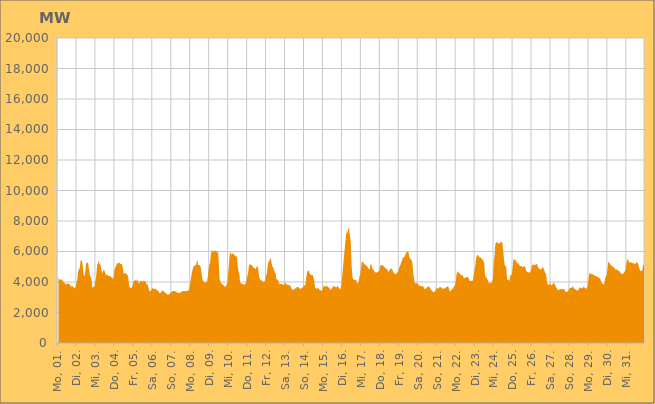
| Category | Series 0 |
|---|---|
|  Mo, 01.  | 4266.584 |
|  Mo, 01.  | 4207.578 |
|  Mo, 01.  | 4142.851 |
|  Mo, 01.  | 4136.333 |
|  Mo, 01.  | 4178.557 |
|  Mo, 01.  | 4119.281 |
|  Mo, 01.  | 4026.68 |
|  Mo, 01.  | 4001.426 |
|  Mo, 01.  | 3944.814 |
|  Mo, 01.  | 3851.609 |
|  Mo, 01.  | 3824.859 |
|  Mo, 01.  | 3942.209 |
|  Mo, 01.  | 3882.206 |
|  Mo, 01.  | 3872.921 |
|  Mo, 01.  | 3870.127 |
|  Mo, 01.  | 3776.172 |
|  Mo, 01.  | 3683.18 |
|  Di, 02.  | 3729.327 |
|  Di, 02.  | 3733.236 |
|  Di, 02.  | 3667.491 |
|  Di, 02.  | 3588.442 |
|  Di, 02.  | 3607.905 |
|  Di, 02.  | 3697.948 |
|  Di, 02.  | 3981.073 |
|  Di, 02.  | 4131.693 |
|  Di, 02.  | 4684.604 |
|  Di, 02.  | 4819.84 |
|  Di, 02.  | 4925.777 |
|  Di, 02.  | 5365.699 |
|  Di, 02.  | 5452.281 |
|  Di, 02.  | 5353.521 |
|  Di, 02.  | 4989.246 |
|  Di, 02.  | 4434.675 |
|  Di, 02.  | 4390.629 |
|  Di, 02.  | 4612.217 |
|  Di, 02.  | 5207.136 |
|  Di, 02.  | 5240.932 |
|  Di, 02.  | 5285.204 |
|  Di, 02.  | 5088 |
|  Di, 02.  | 4704.854 |
|  Di, 02.  | 4386.76 |
|  Mi, 03.  | 4378.635 |
|  Mi, 03.  | 4099.421 |
|  Mi, 03.  | 3653.123 |
|  Mi, 03.  | 3667.025 |
|  Mi, 03.  | 3683.099 |
|  Mi, 03.  | 3785.335 |
|  Mi, 03.  | 4102.896 |
|  Mi, 03.  | 4456.347 |
|  Mi, 03.  | 5098.884 |
|  Mi, 03.  | 5218.346 |
|  Mi, 03.  | 5398.458 |
|  Mi, 03.  | 5198.235 |
|  Mi, 03.  | 5131.548 |
|  Mi, 03.  | 4938.137 |
|  Mi, 03.  | 4635.025 |
|  Mi, 03.  | 4602.471 |
|  Mi, 03.  | 4766.044 |
|  Mi, 03.  | 4805.549 |
|  Mi, 03.  | 4620.981 |
|  Mi, 03.  | 4457.036 |
|  Mi, 03.  | 4480.844 |
|  Mi, 03.  | 4491.056 |
|  Mi, 03.  | 4400.802 |
|  Mi, 03.  | 4400.6 |
|  Do, 04.  | 4395.809 |
|  Do, 04.  | 4376.327 |
|  Do, 04.  | 4290.164 |
|  Do, 04.  | 4306.76 |
|  Do, 04.  | 4186.07 |
|  Do, 04.  | 4304.95 |
|  Do, 04.  | 4773.455 |
|  Do, 04.  | 4964.536 |
|  Do, 04.  | 5024.203 |
|  Do, 04.  | 5283.835 |
|  Do, 04.  | 5169.109 |
|  Do, 04.  | 5235.425 |
|  Do, 04.  | 5294.251 |
|  Do, 04.  | 5225.783 |
|  Do, 04.  | 5175.498 |
|  Do, 04.  | 5171.25 |
|  Do, 04.  | 5111.219 |
|  Do, 04.  | 4751.023 |
|  Do, 04.  | 4503.815 |
|  Do, 04.  | 4572.222 |
|  Do, 04.  | 4595.924 |
|  Do, 04.  | 4549.286 |
|  Do, 04.  | 4498.235 |
|  Do, 04.  | 4381.834 |
|  Fr, 05.  | 4026.381 |
|  Fr, 05.  | 3673.328 |
|  Fr, 05.  | 3605.814 |
|  Fr, 05.  | 3608.928 |
|  Fr, 05.  | 3652.192 |
|  Fr, 05.  | 3755.646 |
|  Fr, 05.  | 4008.803 |
|  Fr, 05.  | 4079.187 |
|  Fr, 05.  | 4126.906 |
|  Fr, 05.  | 4107.322 |
|  Fr, 05.  | 4079.678 |
|  Fr, 05.  | 4154.262 |
|  Fr, 05.  | 4014.946 |
|  Fr, 05.  | 3904.06 |
|  Fr, 05.  | 3971.547 |
|  Fr, 05.  | 4124.928 |
|  Fr, 05.  | 4027.803 |
|  Fr, 05.  | 4024.305 |
|  Fr, 05.  | 4053.006 |
|  Fr, 05.  | 4092.909 |
|  Fr, 05.  | 4064.665 |
|  Fr, 05.  | 4035.888 |
|  Fr, 05.  | 3943.914 |
|  Fr, 05.  | 3823.59 |
|  Sa, 06.  | 3833.231 |
|  Sa, 06.  | 3624.199 |
|  Sa, 06.  | 3404.672 |
|  Sa, 06.  | 3385.497 |
|  Sa, 06.  | 3448.437 |
|  Sa, 06.  | 3504.127 |
|  Sa, 06.  | 3624.401 |
|  Sa, 06.  | 3551.205 |
|  Sa, 06.  | 3544.459 |
|  Sa, 06.  | 3557.966 |
|  Sa, 06.  | 3551.408 |
|  Sa, 06.  | 3498.239 |
|  Sa, 06.  | 3462.628 |
|  Sa, 06.  | 3436.751 |
|  Sa, 06.  | 3347.883 |
|  Sa, 06.  | 3255.176 |
|  Sa, 06.  | 3262.053 |
|  Sa, 06.  | 3356.908 |
|  Sa, 06.  | 3379.743 |
|  Sa, 06.  | 3458.865 |
|  Sa, 06.  | 3422.175 |
|  Sa, 06.  | 3351.151 |
|  Sa, 06.  | 3292.023 |
|  Sa, 06.  | 3275.325 |
|  So, 07.  | 3223.044 |
|  So, 07.  | 3169.732 |
|  So, 07.  | 3169.601 |
|  So, 07.  | 3194.148 |
|  So, 07.  | 3223.645 |
|  So, 07.  | 3287.04 |
|  So, 07.  | 3335.56 |
|  So, 07.  | 3388.264 |
|  So, 07.  | 3398.74 |
|  So, 07.  | 3421.246 |
|  So, 07.  | 3399.241 |
|  So, 07.  | 3390.898 |
|  So, 07.  | 3355.918 |
|  So, 07.  | 3319.04 |
|  So, 07.  | 3277.578 |
|  So, 07.  | 3289.176 |
|  So, 07.  | 3278.985 |
|  So, 07.  | 3313.175 |
|  So, 07.  | 3301.348 |
|  So, 07.  | 3361.388 |
|  So, 07.  | 3406.708 |
|  So, 07.  | 3416.514 |
|  So, 07.  | 3380.782 |
|  So, 07.  | 3414.284 |
|  Mo, 08.  | 3396.313 |
|  Mo, 08.  | 3410.681 |
|  Mo, 08.  | 3419.089 |
|  Mo, 08.  | 3415.613 |
|  Mo, 08.  | 3461.163 |
|  Mo, 08.  | 3657.752 |
|  Mo, 08.  | 3959.098 |
|  Mo, 08.  | 4292.898 |
|  Mo, 08.  | 4639.932 |
|  Mo, 08.  | 4811.855 |
|  Mo, 08.  | 5051.792 |
|  Mo, 08.  | 5024.158 |
|  Mo, 08.  | 5118.61 |
|  Mo, 08.  | 5098.471 |
|  Mo, 08.  | 5272.455 |
|  Mo, 08.  | 5440.01 |
|  Mo, 08.  | 5060.81 |
|  Mo, 08.  | 5148.86 |
|  Mo, 08.  | 5084.443 |
|  Mo, 08.  | 5000.263 |
|  Mo, 08.  | 4657.849 |
|  Mo, 08.  | 4265.625 |
|  Mo, 08.  | 4092.357 |
|  Mo, 08.  | 4014.093 |
|  Di, 09.  | 3982.54 |
|  Di, 09.  | 3955.887 |
|  Di, 09.  | 3988.986 |
|  Di, 09.  | 4012.532 |
|  Di, 09.  | 4314.087 |
|  Di, 09.  | 4715.244 |
|  Di, 09.  | 5095.673 |
|  Di, 09.  | 5292.076 |
|  Di, 09.  | 5808.207 |
|  Di, 09.  | 6101.633 |
|  Di, 09.  | 6038.916 |
|  Di, 09.  | 5958.046 |
|  Di, 09.  | 5981.52 |
|  Di, 09.  | 6069.245 |
|  Di, 09.  | 6053.791 |
|  Di, 09.  | 6028.615 |
|  Di, 09.  | 5897.677 |
|  Di, 09.  | 6072.762 |
|  Di, 09.  | 5282.016 |
|  Di, 09.  | 4194.256 |
|  Di, 09.  | 4021.826 |
|  Di, 09.  | 3931.777 |
|  Di, 09.  | 3883.43 |
|  Di, 09.  | 3829.882 |
|  Mi, 10.  | 3788.146 |
|  Mi, 10.  | 3712.188 |
|  Mi, 10.  | 3692.297 |
|  Mi, 10.  | 3729.466 |
|  Mi, 10.  | 3818.103 |
|  Mi, 10.  | 3978.602 |
|  Mi, 10.  | 4589.727 |
|  Mi, 10.  | 5206.673 |
|  Mi, 10.  | 5871.344 |
|  Mi, 10.  | 5962.463 |
|  Mi, 10.  | 5779.443 |
|  Mi, 10.  | 5854.011 |
|  Mi, 10.  | 5884.089 |
|  Mi, 10.  | 5832.502 |
|  Mi, 10.  | 5749.953 |
|  Mi, 10.  | 5710.826 |
|  Mi, 10.  | 5684.763 |
|  Mi, 10.  | 5655.735 |
|  Mi, 10.  | 5042.726 |
|  Mi, 10.  | 4703.938 |
|  Mi, 10.  | 4529.376 |
|  Mi, 10.  | 3979.57 |
|  Mi, 10.  | 3928.338 |
|  Mi, 10.  | 3886.89 |
|  Do, 11.  | 3869.402 |
|  Do, 11.  | 3861.557 |
|  Do, 11.  | 3801.725 |
|  Do, 11.  | 3858.974 |
|  Do, 11.  | 3894.192 |
|  Do, 11.  | 4069.333 |
|  Do, 11.  | 4386.352 |
|  Do, 11.  | 4523.686 |
|  Do, 11.  | 4995.199 |
|  Do, 11.  | 5160.975 |
|  Do, 11.  | 5166.501 |
|  Do, 11.  | 5117.41 |
|  Do, 11.  | 5093.519 |
|  Do, 11.  | 5026.197 |
|  Do, 11.  | 4931.369 |
|  Do, 11.  | 4917.518 |
|  Do, 11.  | 4876.344 |
|  Do, 11.  | 4844.597 |
|  Do, 11.  | 4999.228 |
|  Do, 11.  | 5055.586 |
|  Do, 11.  | 4858.15 |
|  Do, 11.  | 4315.05 |
|  Do, 11.  | 4223.389 |
|  Do, 11.  | 4095.24 |
|  Fr, 12.  | 4128.802 |
|  Fr, 12.  | 4053.192 |
|  Fr, 12.  | 4029.311 |
|  Fr, 12.  | 3972.964 |
|  Fr, 12.  | 4039.48 |
|  Fr, 12.  | 4144.088 |
|  Fr, 12.  | 4435.723 |
|  Fr, 12.  | 4606.4 |
|  Fr, 12.  | 5069.306 |
|  Fr, 12.  | 5360.484 |
|  Fr, 12.  | 5367.358 |
|  Fr, 12.  | 5534.396 |
|  Fr, 12.  | 5508.195 |
|  Fr, 12.  | 5225.88 |
|  Fr, 12.  | 4983.198 |
|  Fr, 12.  | 4957.262 |
|  Fr, 12.  | 4749.433 |
|  Fr, 12.  | 4659.237 |
|  Fr, 12.  | 4536.272 |
|  Fr, 12.  | 4155.428 |
|  Fr, 12.  | 4195.29 |
|  Fr, 12.  | 4113.095 |
|  Fr, 12.  | 3975.654 |
|  Fr, 12.  | 3848.165 |
|  Sa, 13.  | 3872.33 |
|  Sa, 13.  | 3878.477 |
|  Sa, 13.  | 3865.734 |
|  Sa, 13.  | 3841.395 |
|  Sa, 13.  | 3797.026 |
|  Sa, 13.  | 3843.227 |
|  Sa, 13.  | 4008.504 |
|  Sa, 13.  | 3881.286 |
|  Sa, 13.  | 3822.617 |
|  Sa, 13.  | 3823.436 |
|  Sa, 13.  | 3803.688 |
|  Sa, 13.  | 3801.039 |
|  Sa, 13.  | 3773.238 |
|  Sa, 13.  | 3708.212 |
|  Sa, 13.  | 3560.133 |
|  Sa, 13.  | 3527.584 |
|  Sa, 13.  | 3444.236 |
|  Sa, 13.  | 3506.761 |
|  Sa, 13.  | 3535.318 |
|  Sa, 13.  | 3594.088 |
|  Sa, 13.  | 3597.545 |
|  Sa, 13.  | 3676.906 |
|  Sa, 13.  | 3673.902 |
|  Sa, 13.  | 3658.134 |
|  So, 14.  | 3619.079 |
|  So, 14.  | 3523.523 |
|  So, 14.  | 3573.533 |
|  So, 14.  | 3611.802 |
|  So, 14.  | 3639.83 |
|  So, 14.  | 3691.323 |
|  So, 14.  | 3790.863 |
|  So, 14.  | 3760.086 |
|  So, 14.  | 3919.873 |
|  So, 14.  | 4407.218 |
|  So, 14.  | 4659.017 |
|  So, 14.  | 4738.002 |
|  So, 14.  | 4766.876 |
|  So, 14.  | 4545.176 |
|  So, 14.  | 4486.328 |
|  So, 14.  | 4465.832 |
|  So, 14.  | 4436.812 |
|  So, 14.  | 4473.541 |
|  So, 14.  | 4257.081 |
|  So, 14.  | 4028.457 |
|  So, 14.  | 3608.156 |
|  So, 14.  | 3605.114 |
|  So, 14.  | 3531.269 |
|  So, 14.  | 3588.919 |
|  Mo, 15.  | 3611.145 |
|  Mo, 15.  | 3522.345 |
|  Mo, 15.  | 3453.403 |
|  Mo, 15.  | 3461.085 |
|  Mo, 15.  | 3395.567 |
|  Mo, 15.  | 3487.022 |
|  Mo, 15.  | 3644.004 |
|  Mo, 15.  | 3766.616 |
|  Mo, 15.  | 3720.415 |
|  Mo, 15.  | 3687.92 |
|  Mo, 15.  | 3761.296 |
|  Mo, 15.  | 3731.5 |
|  Mo, 15.  | 3690.912 |
|  Mo, 15.  | 3634.153 |
|  Mo, 15.  | 3620.737 |
|  Mo, 15.  | 3501.559 |
|  Mo, 15.  | 3503.364 |
|  Mo, 15.  | 3586.759 |
|  Mo, 15.  | 3633.574 |
|  Mo, 15.  | 3713.001 |
|  Mo, 15.  | 3762.418 |
|  Mo, 15.  | 3684.34 |
|  Mo, 15.  | 3669.077 |
|  Mo, 15.  | 3641.853 |
|  Di, 16.  | 3712.756 |
|  Di, 16.  | 3731.158 |
|  Di, 16.  | 3621.221 |
|  Di, 16.  | 3512.816 |
|  Di, 16.  | 3555.695 |
|  Di, 16.  | 3738.116 |
|  Di, 16.  | 4230.882 |
|  Di, 16.  | 4791.6 |
|  Di, 16.  | 5408.756 |
|  Di, 16.  | 5958.473 |
|  Di, 16.  | 6487.033 |
|  Di, 16.  | 7029.712 |
|  Di, 16.  | 7419.717 |
|  Di, 16.  | 7153.472 |
|  Di, 16.  | 7556.917 |
|  Di, 16.  | 7477.579 |
|  Di, 16.  | 7007.325 |
|  Di, 16.  | 6740.205 |
|  Di, 16.  | 5223.879 |
|  Di, 16.  | 4396.474 |
|  Di, 16.  | 4157.353 |
|  Di, 16.  | 4187.06 |
|  Di, 16.  | 4131.433 |
|  Di, 16.  | 4137.685 |
|  Mi, 17.  | 4116.645 |
|  Mi, 17.  | 3937.646 |
|  Mi, 17.  | 3891.152 |
|  Mi, 17.  | 4045.145 |
|  Mi, 17.  | 4332.059 |
|  Mi, 17.  | 4477.828 |
|  Mi, 17.  | 4861.762 |
|  Mi, 17.  | 5290.53 |
|  Mi, 17.  | 5361.404 |
|  Mi, 17.  | 5273.064 |
|  Mi, 17.  | 5178.638 |
|  Mi, 17.  | 5117.929 |
|  Mi, 17.  | 5139.2 |
|  Mi, 17.  | 5030.591 |
|  Mi, 17.  | 5050.715 |
|  Mi, 17.  | 4895.541 |
|  Mi, 17.  | 4844.927 |
|  Mi, 17.  | 4841.266 |
|  Mi, 17.  | 5138.604 |
|  Mi, 17.  | 5212.792 |
|  Mi, 17.  | 4950.426 |
|  Mi, 17.  | 4832.359 |
|  Mi, 17.  | 4822.388 |
|  Mi, 17.  | 4682.353 |
|  Do, 18.  | 4654.895 |
|  Do, 18.  | 4594.648 |
|  Do, 18.  | 4621.247 |
|  Do, 18.  | 4657.116 |
|  Do, 18.  | 4682.035 |
|  Do, 18.  | 4739.432 |
|  Do, 18.  | 4956.957 |
|  Do, 18.  | 5127.578 |
|  Do, 18.  | 5113.836 |
|  Do, 18.  | 5098.832 |
|  Do, 18.  | 5075.193 |
|  Do, 18.  | 5015.947 |
|  Do, 18.  | 4957.636 |
|  Do, 18.  | 4923.281 |
|  Do, 18.  | 4856.705 |
|  Do, 18.  | 4823.58 |
|  Do, 18.  | 4744.813 |
|  Do, 18.  | 4621.849 |
|  Do, 18.  | 4773.672 |
|  Do, 18.  | 4837.342 |
|  Do, 18.  | 4865.73 |
|  Do, 18.  | 4910.905 |
|  Do, 18.  | 4768.93 |
|  Do, 18.  | 4628.989 |
|  Fr, 19.  | 4584.746 |
|  Fr, 19.  | 4524.075 |
|  Fr, 19.  | 4500.725 |
|  Fr, 19.  | 4555.653 |
|  Fr, 19.  | 4634.17 |
|  Fr, 19.  | 4689.406 |
|  Fr, 19.  | 4891.704 |
|  Fr, 19.  | 5030.415 |
|  Fr, 19.  | 5118.745 |
|  Fr, 19.  | 5296.85 |
|  Fr, 19.  | 5420.494 |
|  Fr, 19.  | 5646.479 |
|  Fr, 19.  | 5592.952 |
|  Fr, 19.  | 5639.565 |
|  Fr, 19.  | 5777.991 |
|  Fr, 19.  | 5874.595 |
|  Fr, 19.  | 5963.642 |
|  Fr, 19.  | 5957.175 |
|  Fr, 19.  | 6001.779 |
|  Fr, 19.  | 5669.946 |
|  Fr, 19.  | 5571.368 |
|  Fr, 19.  | 5494.56 |
|  Fr, 19.  | 5431.453 |
|  Fr, 19.  | 5267.5 |
|  Sa, 20.  | 4727.202 |
|  Sa, 20.  | 4263.007 |
|  Sa, 20.  | 3943.993 |
|  Sa, 20.  | 3894.511 |
|  Sa, 20.  | 3934.349 |
|  Sa, 20.  | 3865.807 |
|  Sa, 20.  | 3931.456 |
|  Sa, 20.  | 3775.553 |
|  Sa, 20.  | 3771.221 |
|  Sa, 20.  | 3737.462 |
|  Sa, 20.  | 3733.583 |
|  Sa, 20.  | 3714.112 |
|  Sa, 20.  | 3734.096 |
|  Sa, 20.  | 3692.733 |
|  Sa, 20.  | 3580.859 |
|  Sa, 20.  | 3516.416 |
|  Sa, 20.  | 3564.171 |
|  Sa, 20.  | 3622.173 |
|  Sa, 20.  | 3676.498 |
|  Sa, 20.  | 3700.053 |
|  Sa, 20.  | 3697.406 |
|  Sa, 20.  | 3650.829 |
|  Sa, 20.  | 3553.666 |
|  Sa, 20.  | 3482.146 |
|  So, 21.  | 3417.088 |
|  So, 21.  | 3364.95 |
|  So, 21.  | 3325.83 |
|  So, 21.  | 3355.656 |
|  So, 21.  | 3399.44 |
|  So, 21.  | 3539.664 |
|  So, 21.  | 3636.151 |
|  So, 21.  | 3549.54 |
|  So, 21.  | 3570.533 |
|  So, 21.  | 3643.026 |
|  So, 21.  | 3666.054 |
|  So, 21.  | 3670.703 |
|  So, 21.  | 3606.56 |
|  So, 21.  | 3571.288 |
|  So, 21.  | 3585.232 |
|  So, 21.  | 3550.393 |
|  So, 21.  | 3579.322 |
|  So, 21.  | 3635.507 |
|  So, 21.  | 3665.135 |
|  So, 21.  | 3692.584 |
|  So, 21.  | 3735.339 |
|  So, 21.  | 3619.553 |
|  So, 21.  | 3442.515 |
|  So, 21.  | 3370.719 |
|  Mo, 22.  | 3463.812 |
|  Mo, 22.  | 3508.062 |
|  Mo, 22.  | 3557.531 |
|  Mo, 22.  | 3633.777 |
|  Mo, 22.  | 3726.341 |
|  Mo, 22.  | 3781.764 |
|  Mo, 22.  | 4046.092 |
|  Mo, 22.  | 4521.04 |
|  Mo, 22.  | 4661.677 |
|  Mo, 22.  | 4700.317 |
|  Mo, 22.  | 4569.704 |
|  Mo, 22.  | 4579.692 |
|  Mo, 22.  | 4485.39 |
|  Mo, 22.  | 4439.399 |
|  Mo, 22.  | 4411.411 |
|  Mo, 22.  | 4481.838 |
|  Mo, 22.  | 4234.955 |
|  Mo, 22.  | 4264.389 |
|  Mo, 22.  | 4277.714 |
|  Mo, 22.  | 4291.098 |
|  Mo, 22.  | 4340.023 |
|  Mo, 22.  | 4337.639 |
|  Mo, 22.  | 4250.189 |
|  Mo, 22.  | 4177.259 |
|  Di, 23.  | 4039.208 |
|  Di, 23.  | 4069.626 |
|  Di, 23.  | 4085.93 |
|  Di, 23.  | 4067.467 |
|  Di, 23.  | 4199.35 |
|  Di, 23.  | 4566.604 |
|  Di, 23.  | 4846.334 |
|  Di, 23.  | 5157.302 |
|  Di, 23.  | 5643.066 |
|  Di, 23.  | 5750.118 |
|  Di, 23.  | 5774.014 |
|  Di, 23.  | 5699.271 |
|  Di, 23.  | 5608.374 |
|  Di, 23.  | 5609.434 |
|  Di, 23.  | 5587.192 |
|  Di, 23.  | 5498.422 |
|  Di, 23.  | 5488.226 |
|  Di, 23.  | 5364.518 |
|  Di, 23.  | 5226.027 |
|  Di, 23.  | 4464.973 |
|  Di, 23.  | 4318.953 |
|  Di, 23.  | 4275.583 |
|  Di, 23.  | 4171.025 |
|  Di, 23.  | 4034.883 |
|  Mi, 24.  | 3923.116 |
|  Mi, 24.  | 3925.352 |
|  Mi, 24.  | 3933.354 |
|  Mi, 24.  | 3939.658 |
|  Mi, 24.  | 4017.312 |
|  Mi, 24.  | 4254.842 |
|  Mi, 24.  | 5314.242 |
|  Mi, 24.  | 5633.86 |
|  Mi, 24.  | 6462.559 |
|  Mi, 24.  | 6592.733 |
|  Mi, 24.  | 6593.322 |
|  Mi, 24.  | 6624.795 |
|  Mi, 24.  | 6485.382 |
|  Mi, 24.  | 6561.444 |
|  Mi, 24.  | 6516.26 |
|  Mi, 24.  | 6664.373 |
|  Mi, 24.  | 6635.365 |
|  Mi, 24.  | 6532.393 |
|  Mi, 24.  | 6053.335 |
|  Mi, 24.  | 5486.807 |
|  Mi, 24.  | 5084.122 |
|  Mi, 24.  | 5069.213 |
|  Mi, 24.  | 4857.856 |
|  Mi, 24.  | 4154.853 |
|  Do, 25.  | 4148.204 |
|  Do, 25.  | 4130.334 |
|  Do, 25.  | 4054.011 |
|  Do, 25.  | 4411.047 |
|  Do, 25.  | 4457.971 |
|  Do, 25.  | 4540.706 |
|  Do, 25.  | 4979.749 |
|  Do, 25.  | 5477.628 |
|  Do, 25.  | 5499.283 |
|  Do, 25.  | 5433.53 |
|  Do, 25.  | 5413.103 |
|  Do, 25.  | 5290.601 |
|  Do, 25.  | 5194.91 |
|  Do, 25.  | 5255.19 |
|  Do, 25.  | 5139.274 |
|  Do, 25.  | 5062.966 |
|  Do, 25.  | 5043.404 |
|  Do, 25.  | 5066.42 |
|  Do, 25.  | 4957.723 |
|  Do, 25.  | 4978.344 |
|  Do, 25.  | 5052.29 |
|  Do, 25.  | 5022.643 |
|  Do, 25.  | 4990.197 |
|  Do, 25.  | 4750.937 |
|  Fr, 26.  | 4677.297 |
|  Fr, 26.  | 4643.542 |
|  Fr, 26.  | 4632.564 |
|  Fr, 26.  | 4620.64 |
|  Fr, 26.  | 4639.372 |
|  Fr, 26.  | 4735.122 |
|  Fr, 26.  | 4986.618 |
|  Fr, 26.  | 5121.39 |
|  Fr, 26.  | 5135.882 |
|  Fr, 26.  | 5135.246 |
|  Fr, 26.  | 5110.746 |
|  Fr, 26.  | 5143.795 |
|  Fr, 26.  | 5172.835 |
|  Fr, 26.  | 5170.799 |
|  Fr, 26.  | 4984.992 |
|  Fr, 26.  | 4884.945 |
|  Fr, 26.  | 4873.803 |
|  Fr, 26.  | 4822.868 |
|  Fr, 26.  | 4815.503 |
|  Fr, 26.  | 4917.574 |
|  Fr, 26.  | 4974.638 |
|  Fr, 26.  | 4915.606 |
|  Fr, 26.  | 4793.88 |
|  Fr, 26.  | 4597.869 |
|  Sa, 27.  | 4557.883 |
|  Sa, 27.  | 4223.953 |
|  Sa, 27.  | 3868.317 |
|  Sa, 27.  | 3807.978 |
|  Sa, 27.  | 3873.125 |
|  Sa, 27.  | 3821.399 |
|  Sa, 27.  | 3888.236 |
|  Sa, 27.  | 3783.87 |
|  Sa, 27.  | 3784.152 |
|  Sa, 27.  | 3890.231 |
|  Sa, 27.  | 3981.987 |
|  Sa, 27.  | 3879.348 |
|  Sa, 27.  | 3782.508 |
|  Sa, 27.  | 3615.399 |
|  Sa, 27.  | 3572.959 |
|  Sa, 27.  | 3478.15 |
|  Sa, 27.  | 3460.037 |
|  Sa, 27.  | 3488.381 |
|  Sa, 27.  | 3527.228 |
|  Sa, 27.  | 3536.652 |
|  Sa, 27.  | 3524.723 |
|  Sa, 27.  | 3520.694 |
|  Sa, 27.  | 3549.242 |
|  Sa, 27.  | 3543.401 |
|  So, 28.  | 3451.496 |
|  So, 28.  | 3335.454 |
|  So, 28.  | 3350.832 |
|  So, 28.  | 3375.617 |
|  So, 28.  | 3370.833 |
|  So, 28.  | 3483.482 |
|  So, 28.  | 3595.405 |
|  So, 28.  | 3601.801 |
|  So, 28.  | 3629.609 |
|  So, 28.  | 3616.971 |
|  So, 28.  | 3726.329 |
|  So, 28.  | 3633.851 |
|  So, 28.  | 3566.982 |
|  So, 28.  | 3524.145 |
|  So, 28.  | 3491.335 |
|  So, 28.  | 3452.912 |
|  So, 28.  | 3441.216 |
|  So, 28.  | 3481.659 |
|  So, 28.  | 3562.657 |
|  So, 28.  | 3614.258 |
|  So, 28.  | 3647.09 |
|  So, 28.  | 3600.201 |
|  So, 28.  | 3587.489 |
|  So, 28.  | 3629.851 |
|  Mo, 29.  | 3700.453 |
|  Mo, 29.  | 3628.68 |
|  Mo, 29.  | 3612.233 |
|  Mo, 29.  | 3529.21 |
|  Mo, 29.  | 3643.881 |
|  Mo, 29.  | 3792.109 |
|  Mo, 29.  | 4242.861 |
|  Mo, 29.  | 4604.357 |
|  Mo, 29.  | 4563.743 |
|  Mo, 29.  | 4530.669 |
|  Mo, 29.  | 4514.811 |
|  Mo, 29.  | 4518.358 |
|  Mo, 29.  | 4447.195 |
|  Mo, 29.  | 4460.253 |
|  Mo, 29.  | 4411.215 |
|  Mo, 29.  | 4387.643 |
|  Mo, 29.  | 4371.717 |
|  Mo, 29.  | 4323.197 |
|  Mo, 29.  | 4348.945 |
|  Mo, 29.  | 4253.122 |
|  Mo, 29.  | 4267.03 |
|  Mo, 29.  | 4191.262 |
|  Mo, 29.  | 4023.152 |
|  Mo, 29.  | 3916.057 |
|  Di, 30.  | 3904.397 |
|  Di, 30.  | 3817.873 |
|  Di, 30.  | 3885.806 |
|  Di, 30.  | 4243.077 |
|  Di, 30.  | 4358.559 |
|  Di, 30.  | 4465.347 |
|  Di, 30.  | 4812.431 |
|  Di, 30.  | 5335.599 |
|  Di, 30.  | 5291.695 |
|  Di, 30.  | 5197.013 |
|  Di, 30.  | 5113.583 |
|  Di, 30.  | 5082.324 |
|  Di, 30.  | 5021.183 |
|  Di, 30.  | 4998.903 |
|  Di, 30.  | 4968.038 |
|  Di, 30.  | 4933.513 |
|  Di, 30.  | 4812.237 |
|  Di, 30.  | 4816.55 |
|  Di, 30.  | 4828.125 |
|  Di, 30.  | 4775.187 |
|  Di, 30.  | 4717.522 |
|  Di, 30.  | 4707.184 |
|  Di, 30.  | 4639.94 |
|  Di, 30.  | 4538.451 |
|  Mi, 31.  | 4522.314 |
|  Mi, 31.  | 4521.295 |
|  Mi, 31.  | 4544.187 |
|  Mi, 31.  | 4621.807 |
|  Mi, 31.  | 4709.979 |
|  Mi, 31.  | 4829.943 |
|  Mi, 31.  | 5239.974 |
|  Mi, 31.  | 5476.851 |
|  Mi, 31.  | 5463.878 |
|  Mi, 31.  | 5343.776 |
|  Mi, 31.  | 5264.714 |
|  Mi, 31.  | 5302.553 |
|  Mi, 31.  | 5260.291 |
|  Mi, 31.  | 5298.545 |
|  Mi, 31.  | 5211.63 |
|  Mi, 31.  | 5257.025 |
|  Mi, 31.  | 5157.106 |
|  Mi, 31.  | 5237.544 |
|  Mi, 31.  | 5200.317 |
|  Mi, 31.  | 5298.253 |
|  Mi, 31.  | 5277.95 |
|  Mi, 31.  | 5153.272 |
|  Mi, 31.  | 4955.166 |
|  Mi, 31.  | 4802.486 |
|  Do, 01.  | 4706.451 |
|  Do, 01.  | 4733.736 |
|  Do, 01.  | 4746.853 |
|  Do, 01.  | 5065.423 |
|  Do, 01.  | 5130.598 |
|  Do, 01.  | 5340.635 |